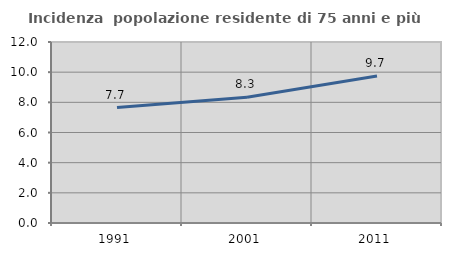
| Category | Incidenza  popolazione residente di 75 anni e più |
|---|---|
| 1991.0 | 7.656 |
| 2001.0 | 8.335 |
| 2011.0 | 9.741 |